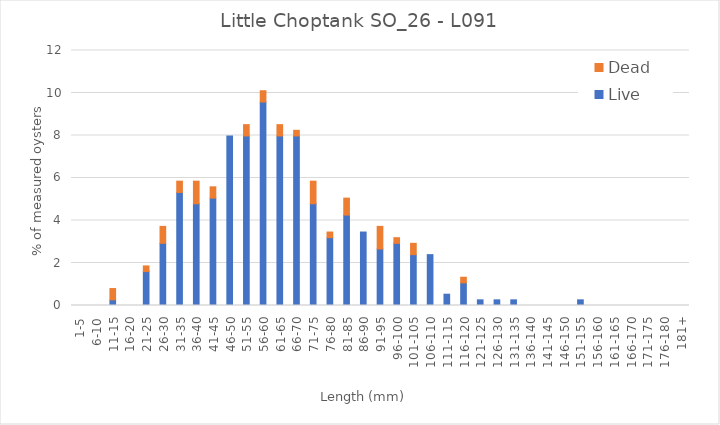
| Category | Live | Dead |
|---|---|---|
| 1-5 | 0 | 0 |
| 6-10 | 0 | 0 |
| 11-15 | 0.266 | 0.532 |
| 16-20 | 0 | 0 |
| 21-25 | 1.596 | 0.266 |
| 26-30 | 2.926 | 0.798 |
| 31-35 | 5.319 | 0.532 |
| 36-40 | 4.787 | 1.064 |
| 41-45 | 5.053 | 0.532 |
| 46-50 | 7.979 | 0 |
| 51-55 | 7.979 | 0.532 |
| 56-60 | 9.574 | 0.532 |
| 61-65 | 7.979 | 0.532 |
| 66-70 | 7.979 | 0.266 |
| 71-75 | 4.787 | 1.064 |
| 76-80 | 3.191 | 0.266 |
| 81-85 | 4.255 | 0.798 |
| 86-90 | 3.457 | 0 |
| 91-95 | 2.66 | 1.064 |
| 96-100 | 2.926 | 0.266 |
| 101-105 | 2.394 | 0.532 |
| 106-110 | 2.394 | 0 |
| 111-115 | 0.532 | 0 |
| 116-120 | 1.064 | 0.266 |
| 121-125 | 0.266 | 0 |
| 126-130 | 0.266 | 0 |
| 131-135 | 0.266 | 0 |
| 136-140 | 0 | 0 |
| 141-145 | 0 | 0 |
| 146-150 | 0 | 0 |
| 151-155 | 0.266 | 0 |
| 156-160 | 0 | 0 |
| 161-165 | 0 | 0 |
| 166-170 | 0 | 0 |
| 171-175 | 0 | 0 |
| 176-180 | 0 | 0 |
| 181+ | 0 | 0 |